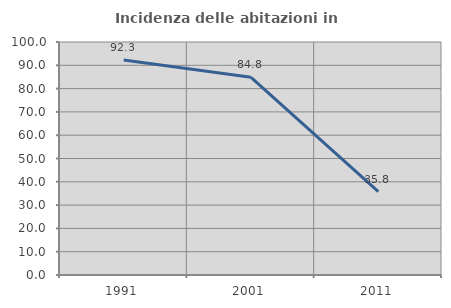
| Category | Incidenza delle abitazioni in proprietà  |
|---|---|
| 1991.0 | 92.265 |
| 2001.0 | 84.831 |
| 2011.0 | 35.802 |